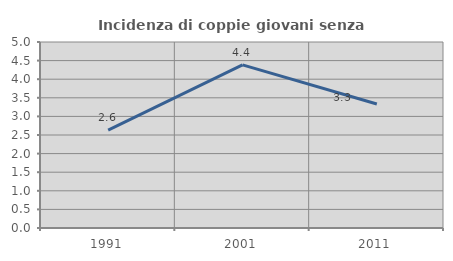
| Category | Incidenza di coppie giovani senza figli |
|---|---|
| 1991.0 | 2.632 |
| 2001.0 | 4.386 |
| 2011.0 | 3.333 |